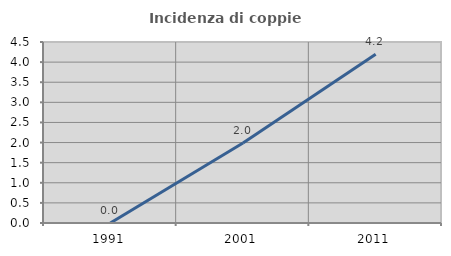
| Category | Incidenza di coppie miste |
|---|---|
| 1991.0 | 0 |
| 2001.0 | 1.987 |
| 2011.0 | 4.197 |